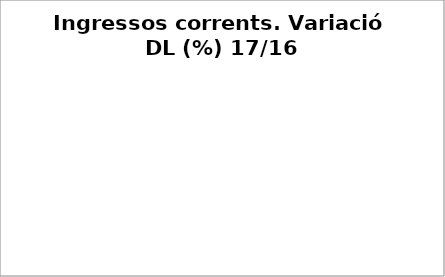
| Category | Series 0 |
|---|---|
| Impostos locals | 0.012 |
| Participació Tributs de l'Estat | 0.043 |
| Taxes i altres ingressos | -0.077 |
| Transferències corrents (exc. FCF) | -0.075 |
| Ingressos patrimonials | 0.047 |
| Ingressos corrents | 0.011 |